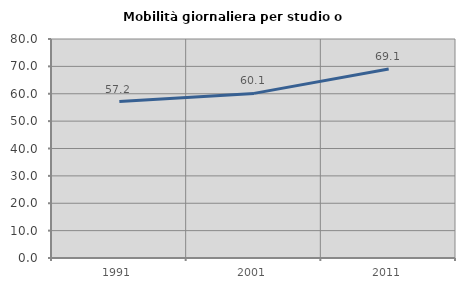
| Category | Mobilità giornaliera per studio o lavoro |
|---|---|
| 1991.0 | 57.158 |
| 2001.0 | 60.129 |
| 2011.0 | 69.062 |